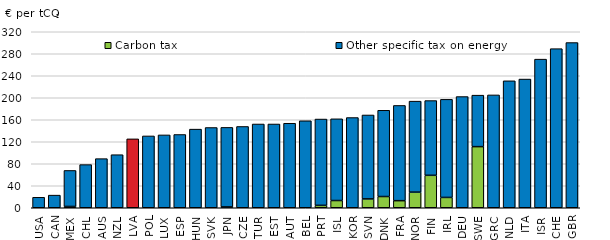
| Category | Carbon tax | Other specific tax on energy |
|---|---|---|
| USA | 0 | 19.037 |
| CAN | 0 | 22.965 |
| MEX | 2.339 | 65.486 |
| CHL | 0 | 78.442 |
| AUS | 0 | 89.29 |
| NZL | 0 | 96.464 |
| LVA | 0 | 125.243 |
| POL | 0 | 130.59 |
| LUX | 0 | 132.417 |
| ESP | 0 | 133.189 |
| HUN | 0 | 142.982 |
| SVK | 0 | 145.888 |
| JPN | 1.504 | 144.622 |
| CZE | 0 | 147.808 |
| TUR | 0 | 152.273 |
| EST | 0 | 152.284 |
| AUT | 0 | 153.638 |
| BEL | 0 | 158.127 |
| PRT | 4.374 | 156.912 |
| ISL | 13.134 | 148.573 |
| KOR | 0 | 164.019 |
| SVN | 16.085 | 152.601 |
| DNK | 20.398 | 156.826 |
| FRA | 12.88 | 173.151 |
| NOR | 28.362 | 165.479 |
| FIN | 58.978 | 135.906 |
| IRL | 18.753 | 178.355 |
| DEU | 0 | 202.178 |
| SWE | 111.12 | 93.619 |
| GRC | 0 | 205.151 |
| NLD | 0 | 230.804 |
| ITA | 0 | 233.998 |
| ISR | 0 | 270.207 |
| CHE | 0 | 289.288 |
| GBR | 0 | 300.363 |